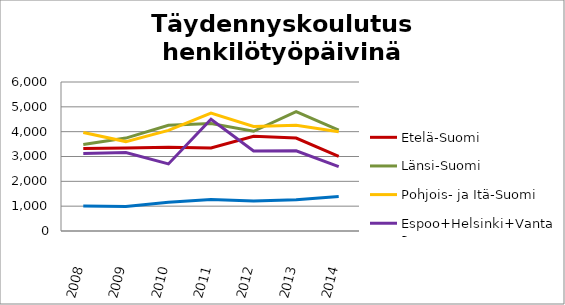
| Category | Etelä-Suomi | Länsi-Suomi | Pohjois- ja Itä-Suomi | Espoo+Helsinki+Vantaa | Muu Uusimaa |
|---|---|---|---|---|---|
| 2008.0 | 3318 | 3484.19 | 3968.9 | 3123 | 1007.3 |
| 2009.0 | 3347 | 3741.7 | 3600.4 | 3157 | 991.5 |
| 2010.0 | 3370.75 | 4254.41 | 4052.08 | 2701.5 | 1159 |
| 2011.0 | 3345.5 | 4325.5 | 4746 | 4501 | 1270.7 |
| 2012.0 | 3816.8 | 4014.5 | 4208 | 3221 | 1203.3 |
| 2013.0 | 3743 | 4806 | 4253.5 | 3230.5 | 1259.5 |
| 2014.0 | 3007.5 | 4057.3 | 3995.5 | 2589.5 | 1390.9 |